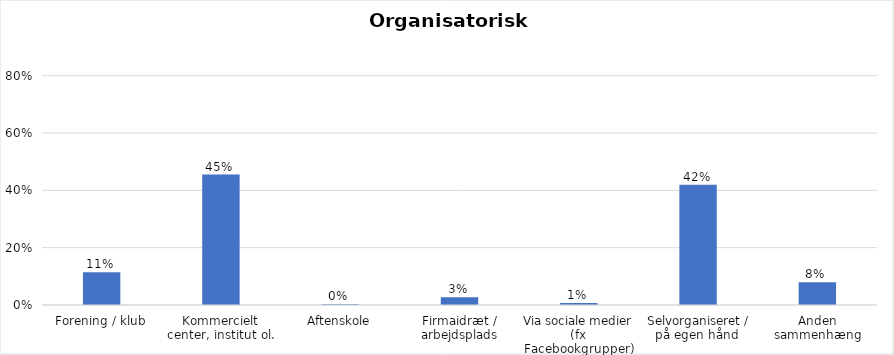
| Category | % |
|---|---|
| Forening / klub | 0.115 |
| Kommercielt center, institut ol. | 0.455 |
| Aftenskole | 0.003 |
| Firmaidræt / arbejdsplads | 0.027 |
| Via sociale medier (fx Facebookgrupper) | 0.007 |
| Selvorganiseret / på egen hånd  | 0.42 |
| Anden sammenhæng | 0.079 |